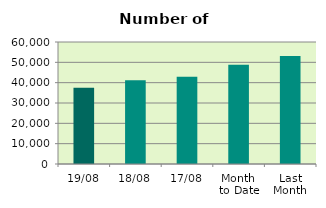
| Category | Series 0 |
|---|---|
| 19/08 | 37504 |
| 18/08 | 41180 |
| 17/08 | 42872 |
| Month 
to Date | 48765.846 |
| Last
Month | 53071.913 |